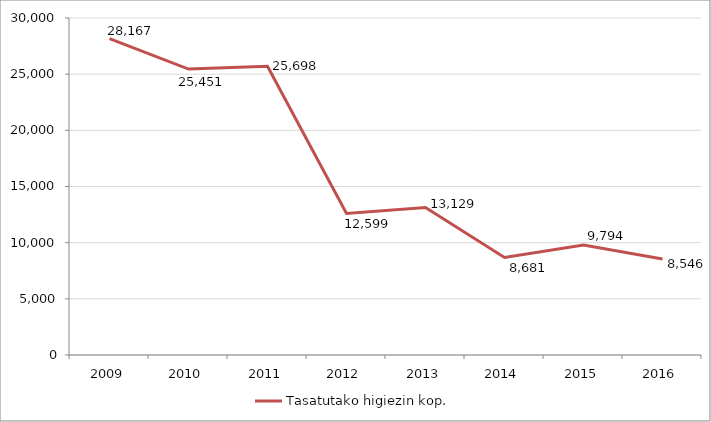
| Category | Tasatutako higiezin kop. |
|---|---|
| 2009.0 | 28167 |
| 2010.0 | 25451 |
| 2011.0 | 25698 |
| 2012.0 | 12599 |
| 2013.0 | 13129 |
| 2014.0 | 8681 |
| 2015.0 | 9793.5 |
| 2016.0 | 8546 |